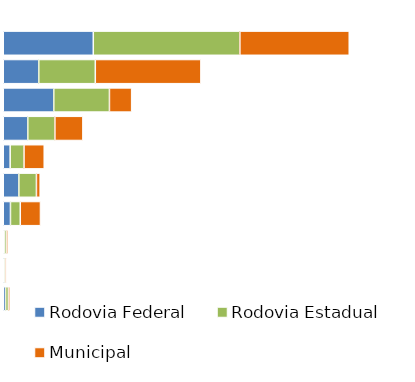
| Category | Rodovia Federal | Rodovia Estadual | Municipal |
|---|---|---|---|
| Automóveis | 312 | 508 | 379 |
| Motos e Motonetas | 123 | 196 | 366 |
| Caminhão e Caminhão Trator | 175 | 193 | 77 |
| Caminhonetes e Camionetas | 85 | 94 | 97 |
| Bicicletas | 24 | 48 | 70 |
| Reboques | 54 | 61 | 13 |
| Ônibus e Microônibus | 25 | 34 | 70 |
| Tratores | 4 | 7 | 6 |
| Carroças | 4 | 5 | 2 |
| Outros | 8 | 10 | 6 |